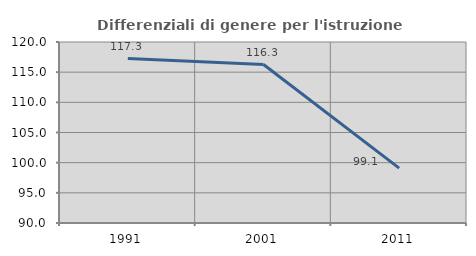
| Category | Differenziali di genere per l'istruzione superiore |
|---|---|
| 1991.0 | 117.261 |
| 2001.0 | 116.269 |
| 2011.0 | 99.104 |